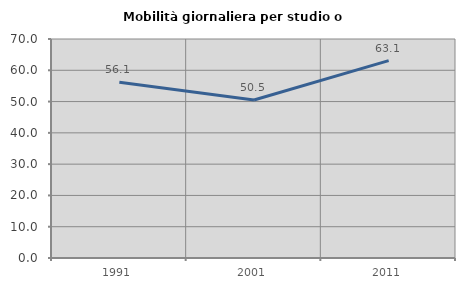
| Category | Mobilità giornaliera per studio o lavoro |
|---|---|
| 1991.0 | 56.15 |
| 2001.0 | 50.517 |
| 2011.0 | 63.104 |